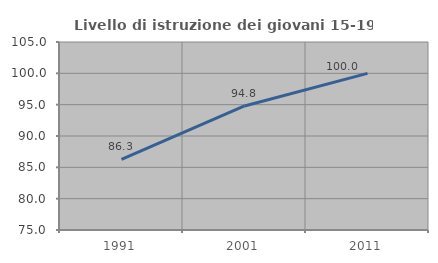
| Category | Livello di istruzione dei giovani 15-19 anni |
|---|---|
| 1991.0 | 86.268 |
| 2001.0 | 94.798 |
| 2011.0 | 100 |